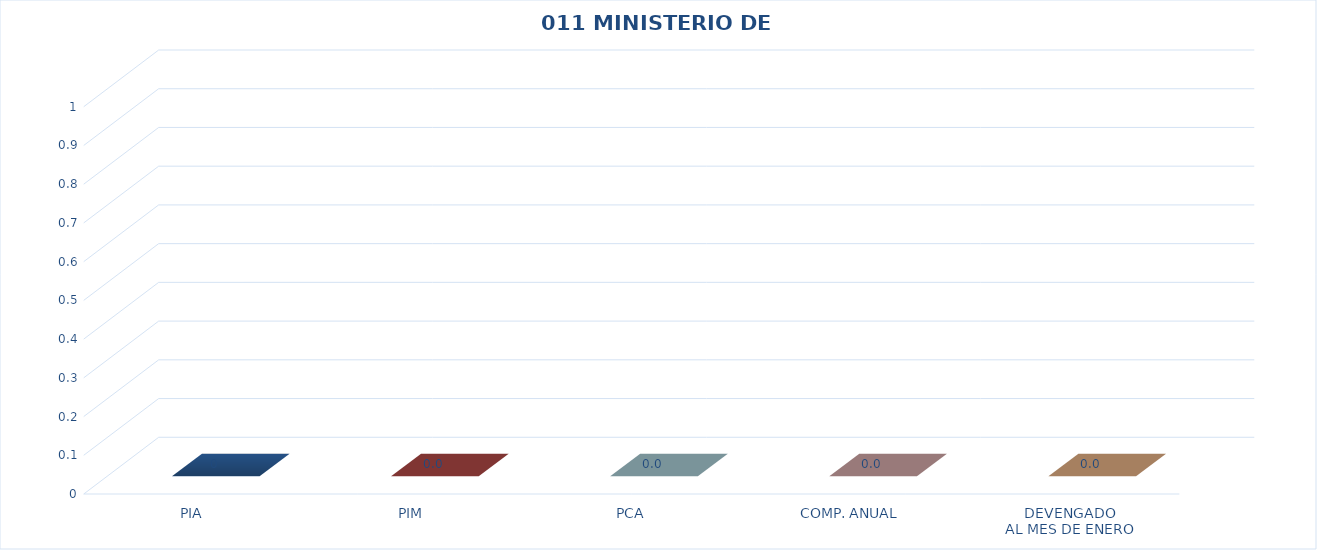
| Category | 011 MINISTERIO DE SALUD |
|---|---|
| PIA | 0 |
| PIM | 0 |
| PCA | 0 |
| COMP. ANUAL | 0 |
| DEVENGADO
AL MES DE ENERO | 0 |